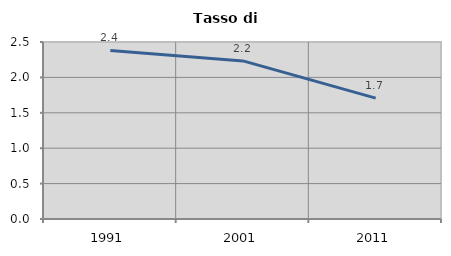
| Category | Tasso di disoccupazione   |
|---|---|
| 1991.0 | 2.381 |
| 2001.0 | 2.233 |
| 2011.0 | 1.707 |